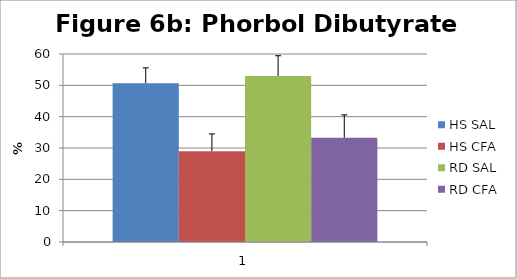
| Category | HS SAL | HS CFA | RD SAL | RD CFA |
|---|---|---|---|---|
| 0 | 50.675 | 28.992 | 52.947 | 33.273 |